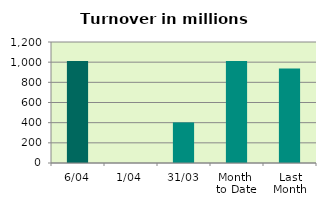
| Category | Series 0 |
|---|---|
| 6/04 | 1011.662 |
| 1/04 | 0 |
| 31/03 | 402.392 |
| Month 
to Date | 1011.662 |
| Last
Month | 937.305 |